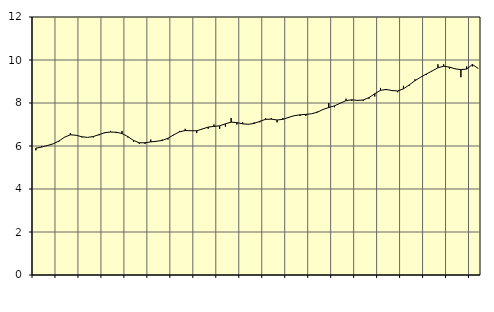
| Category | Piggar | Offentlig förvaltning m.m., SNI 84, 99 |
|---|---|---|
| nan | 5.8 | 5.9 |
| 1.0 | 6 | 5.95 |
| 1.0 | 6 | 6.02 |
| 1.0 | 6.1 | 6.1 |
| nan | 6.2 | 6.23 |
| 2.0 | 6.4 | 6.41 |
| 2.0 | 6.6 | 6.52 |
| 2.0 | 6.5 | 6.5 |
| nan | 6.4 | 6.43 |
| 3.0 | 6.4 | 6.4 |
| 3.0 | 6.4 | 6.44 |
| 3.0 | 6.5 | 6.53 |
| nan | 6.6 | 6.62 |
| 4.0 | 6.7 | 6.65 |
| 4.0 | 6.6 | 6.64 |
| 4.0 | 6.7 | 6.58 |
| nan | 6.4 | 6.44 |
| 5.0 | 6.2 | 6.26 |
| 5.0 | 6.1 | 6.15 |
| 5.0 | 6.1 | 6.15 |
| nan | 6.3 | 6.19 |
| 6.0 | 6.2 | 6.22 |
| 6.0 | 6.3 | 6.26 |
| 6.0 | 6.3 | 6.36 |
| nan | 6.5 | 6.52 |
| 7.0 | 6.7 | 6.66 |
| 7.0 | 6.8 | 6.72 |
| 7.0 | 6.7 | 6.71 |
| nan | 6.6 | 6.71 |
| 8.0 | 6.8 | 6.79 |
| 8.0 | 6.8 | 6.88 |
| 8.0 | 7 | 6.91 |
| nan | 6.8 | 6.94 |
| 9.0 | 6.9 | 7.03 |
| 9.0 | 7.3 | 7.11 |
| 9.0 | 7 | 7.09 |
| nan | 7.1 | 7.03 |
| 10.0 | 7 | 7.01 |
| 10.0 | 7.1 | 7.05 |
| 10.0 | 7.1 | 7.15 |
| nan | 7.3 | 7.24 |
| 11.0 | 7.3 | 7.25 |
| 11.0 | 7.1 | 7.21 |
| 11.0 | 7.3 | 7.24 |
| nan | 7.3 | 7.33 |
| 12.0 | 7.4 | 7.41 |
| 12.0 | 7.4 | 7.45 |
| 12.0 | 7.4 | 7.47 |
| nan | 7.5 | 7.5 |
| 13.0 | 7.6 | 7.57 |
| 13.0 | 7.7 | 7.7 |
| 13.0 | 8 | 7.79 |
| nan | 7.8 | 7.87 |
| 14.0 | 8 | 7.99 |
| 14.0 | 8.2 | 8.11 |
| 14.0 | 8.1 | 8.15 |
| nan | 8.1 | 8.12 |
| 15.0 | 8.1 | 8.14 |
| 15.0 | 8.2 | 8.25 |
| 15.0 | 8.3 | 8.43 |
| nan | 8.7 | 8.59 |
| 16.0 | 8.6 | 8.63 |
| 16.0 | 8.6 | 8.58 |
| 16.0 | 8.5 | 8.56 |
| nan | 8.8 | 8.66 |
| 17.0 | 8.8 | 8.84 |
| 17.0 | 9.1 | 9.04 |
| 17.0 | 9.2 | 9.2 |
| nan | 9.3 | 9.35 |
| 18.0 | 9.5 | 9.49 |
| 18.0 | 9.8 | 9.64 |
| 18.0 | 9.8 | 9.71 |
| nan | 9.6 | 9.67 |
| 19.0 | 9.6 | 9.59 |
| 19.0 | 9.2 | 9.55 |
| 19.0 | 9.7 | 9.58 |
| nan | 9.7 | 9.79 |
| 20.0 | 9.6 | 9.61 |